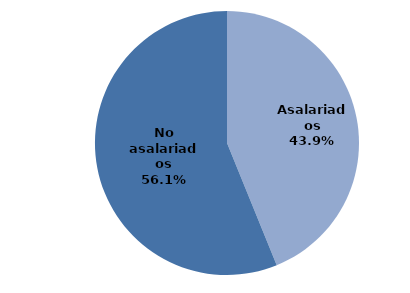
| Category | Series 0 |
|---|---|
| Asalariados | 16.655 |
| No asalariados | 21.325 |